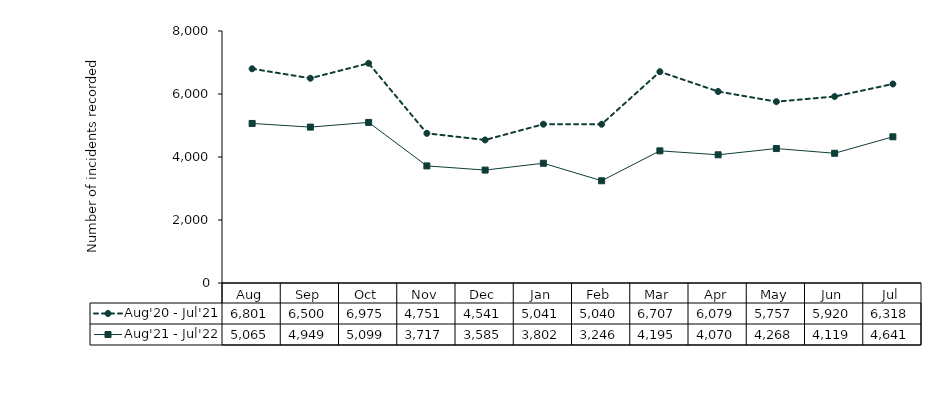
| Category | Aug'20 - Jul'21 | Aug'21 - Jul'22 |
|---|---|---|
| Aug | 6801 | 5065 |
| Sep | 6500 | 4949 |
| Oct | 6975 | 5099 |
| Nov | 4751 | 3717 |
| Dec | 4541 | 3585 |
| Jan | 5041 | 3802 |
| Feb | 5040 | 3246 |
| Mar | 6707 | 4195 |
| Apr | 6079 | 4070 |
| May | 5757 | 4268 |
| Jun | 5920 | 4119 |
| Jul | 6318 | 4641 |